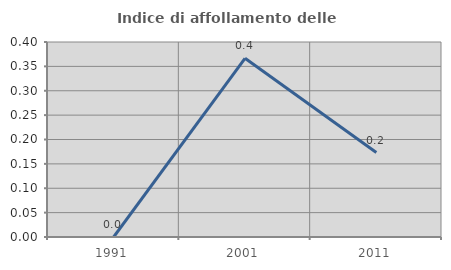
| Category | Indice di affollamento delle abitazioni  |
|---|---|
| 1991.0 | 0 |
| 2001.0 | 0.367 |
| 2011.0 | 0.173 |